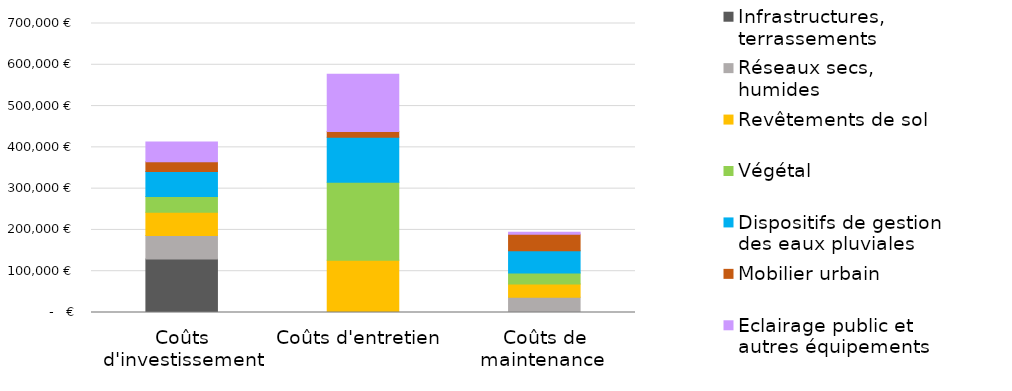
| Category | Infrastructures, terrassements | Réseaux secs, humides | Revêtements de sol  | Végétal | Dispositifs de gestion des eaux pluviales | Mobilier urbain | Eclairage public et autres équipements |
|---|---|---|---|---|---|---|---|
| Coûts d'investissement | 129500 | 57000 | 56500 | 37800 | 61000 | 23220 | 47900 |
| Coûts d'entretien  | 0 | 420 | 126000 | 189000 | 109200 | 13650 | 138900 |
| Coûts de maintenance  | 0 | 37200 | 31650 | 26550 | 54000 | 40425.9 | 4500.39 |